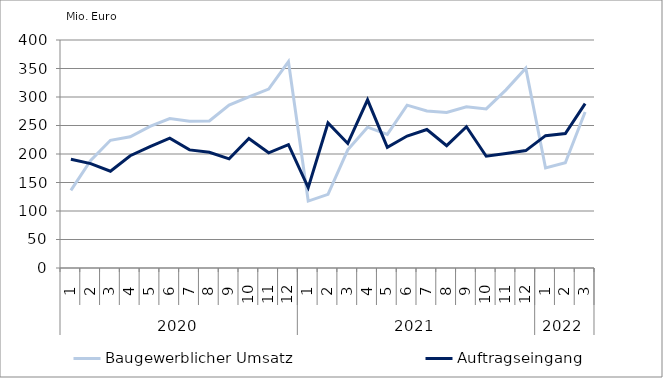
| Category | Baugewerblicher Umsatz | Auftragseingang |
|---|---|---|
| 0 | 136135.432 | 190647.086 |
| 1 | 188682.361 | 183141.14 |
| 2 | 224009.315 | 169770.009 |
| 3 | 230172.252 | 196979.845 |
| 4 | 248410.714 | 212955.83 |
| 5 | 262078.128 | 227853.487 |
| 6 | 257360.37 | 207209.188 |
| 7 | 257932.168 | 202976.091 |
| 8 | 285866.269 | 191463.844 |
| 9 | 300164.57 | 227245.467 |
| 10 | 313922.518 | 202060.636 |
| 11 | 362040.738 | 216296.504 |
| 12 | 117421.805 | 141020.655 |
| 13 | 129162.55 | 254416.876 |
| 14 | 207280.837 | 218451.405 |
| 15 | 247094.279 | 295077.868 |
| 16 | 234515.312 | 211696.129 |
| 17 | 285732.845 | 231455.155 |
| 18 | 275480.885 | 242932.505 |
| 19 | 272787.524 | 214636.944 |
| 20 | 282850.254 | 247827.991 |
| 21 | 279173.21 | 196069.238 |
| 22 | 312511.437 | 201015.897 |
| 23 | 350582.01 | 205949.991 |
| 24 | 175456.852 | 232178.255 |
| 25 | 184578.32 | 236006.862 |
| 26 | 273732.567 | 288451.109 |